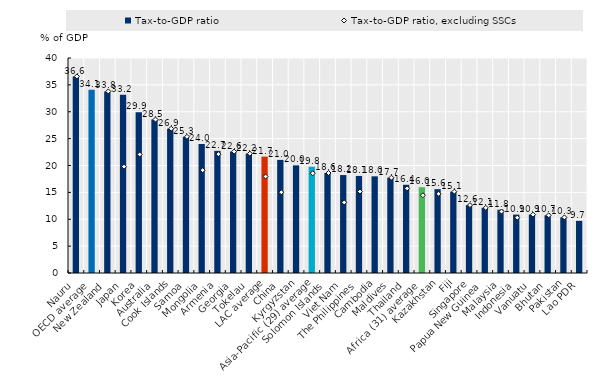
| Category | Tax-to-GDP ratio |
|---|---|
| Nauru | 36.569 |
| OECD average | 34.114 |
| New Zealand | 33.784 |
| Japan | 33.158 |
| Korea | 29.884 |
| Australia | 28.549 |
| Cook Islands | 26.851 |
| Samoa | 25.339 |
| Mongolia | 23.984 |
| Armenia | 22.725 |
| Georgia | 22.582 |
| Tokelau | 22.206 |
| LAC average | 21.653 |
| China | 21.04 |
| Kyrgyzstan | 20.028 |
| Asia-Pacific (29) average | 19.774 |
| Solomon Islands | 18.606 |
| Viet Nam | 18.221 |
| The Philippines | 18.06 |
| Cambodia | 17.985 |
| Maldives | 17.727 |
| Thailand | 16.414 |
| Africa (31) average | 15.964 |
| Kazakhstan | 15.597 |
| Fiji | 15.132 |
| Singapore | 12.63 |
| Papua New Guinea | 12.117 |
| Malaysia | 11.774 |
| Indonesia | 10.866 |
| Vanuatu | 10.854 |
| Bhutan | 10.728 |
| Pakistan | 10.344 |
| Lao PDR | 9.704 |